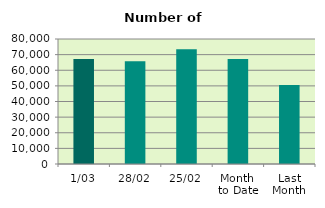
| Category | Series 0 |
|---|---|
| 1/03 | 67190 |
| 28/02 | 65686 |
| 25/02 | 73468 |
| Month 
to Date | 67190 |
| Last
Month | 50484.7 |